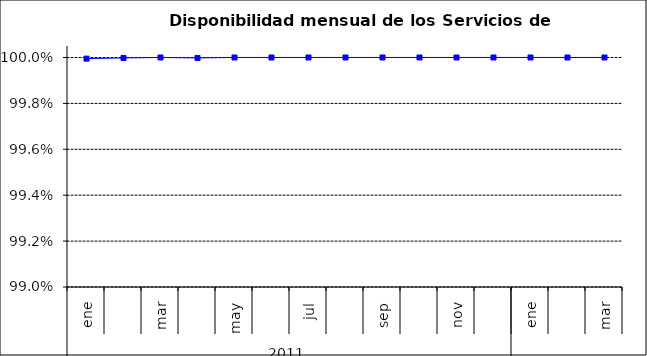
| Category | SCL * |
|---|---|
| 0 | 1 |
| 1 | 1 |
| 2 | 1 |
| 3 | 1 |
| 4 | 1 |
| 5 | 1 |
| 6 | 1 |
| 7 | 1 |
| 8 | 1 |
| 9 | 1 |
| 10 | 1 |
| 11 | 1 |
| 12 | 1 |
| 13 | 1 |
| 14 | 1 |